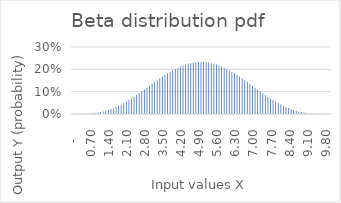
| Category | y-pdf |
|---|---|
| 0.0 | 0 |
| 0.1 | 0 |
| 0.2 | 0 |
| 0.30000000000000004 | 0 |
| 0.4 | 0 |
| 0.5 | 0.001 |
| 0.6 | 0.001 |
| 0.7 | 0.002 |
| 0.7999999999999999 | 0.003 |
| 0.8999999999999999 | 0.005 |
| 0.9999999999999999 | 0.007 |
| 1.0999999999999999 | 0.009 |
| 1.2 | 0.011 |
| 1.3 | 0.014 |
| 1.4000000000000001 | 0.018 |
| 1.5000000000000002 | 0.022 |
| 1.6000000000000003 | 0.027 |
| 1.7000000000000004 | 0.031 |
| 1.8000000000000005 | 0.037 |
| 1.9000000000000006 | 0.043 |
| 2.0000000000000004 | 0.049 |
| 2.1000000000000005 | 0.055 |
| 2.2000000000000006 | 0.062 |
| 2.3000000000000007 | 0.07 |
| 2.400000000000001 | 0.077 |
| 2.500000000000001 | 0.085 |
| 2.600000000000001 | 0.093 |
| 2.700000000000001 | 0.101 |
| 2.800000000000001 | 0.11 |
| 2.9000000000000012 | 0.118 |
| 3.0000000000000013 | 0.126 |
| 3.1000000000000014 | 0.135 |
| 3.2000000000000015 | 0.143 |
| 3.3000000000000016 | 0.151 |
| 3.4000000000000017 | 0.16 |
| 3.5000000000000018 | 0.167 |
| 3.600000000000002 | 0.175 |
| 3.700000000000002 | 0.182 |
| 3.800000000000002 | 0.189 |
| 3.900000000000002 | 0.196 |
| 4.000000000000002 | 0.202 |
| 4.100000000000001 | 0.207 |
| 4.200000000000001 | 0.213 |
| 4.300000000000001 | 0.217 |
| 4.4 | 0.221 |
| 4.5 | 0.225 |
| 4.6 | 0.228 |
| 4.699999999999999 | 0.23 |
| 4.799999999999999 | 0.232 |
| 4.899999999999999 | 0.232 |
| 4.999999999999998 | 0.233 |
| 5.099999999999998 | 0.232 |
| 5.1999999999999975 | 0.232 |
| 5.299999999999997 | 0.23 |
| 5.399999999999997 | 0.228 |
| 5.4999999999999964 | 0.225 |
| 5.599999999999996 | 0.221 |
| 5.699999999999996 | 0.217 |
| 5.799999999999995 | 0.213 |
| 5.899999999999995 | 0.207 |
| 5.999999999999995 | 0.202 |
| 6.099999999999994 | 0.196 |
| 6.199999999999994 | 0.189 |
| 6.299999999999994 | 0.182 |
| 6.399999999999993 | 0.175 |
| 6.499999999999993 | 0.167 |
| 6.5999999999999925 | 0.16 |
| 6.699999999999992 | 0.151 |
| 6.799999999999992 | 0.143 |
| 6.8999999999999915 | 0.135 |
| 6.999999999999991 | 0.126 |
| 7.099999999999991 | 0.118 |
| 7.19999999999999 | 0.11 |
| 7.29999999999999 | 0.101 |
| 7.39999999999999 | 0.093 |
| 7.499999999999989 | 0.085 |
| 7.599999999999989 | 0.077 |
| 7.699999999999989 | 0.07 |
| 7.799999999999988 | 0.062 |
| 7.899999999999988 | 0.055 |
| 7.999999999999988 | 0.049 |
| 8.099999999999987 | 0.043 |
| 8.199999999999987 | 0.037 |
| 8.299999999999986 | 0.031 |
| 8.399999999999986 | 0.027 |
| 8.499999999999986 | 0.022 |
| 8.599999999999985 | 0.018 |
| 8.699999999999985 | 0.014 |
| 8.799999999999985 | 0.011 |
| 8.899999999999984 | 0.009 |
| 8.999999999999984 | 0.007 |
| 9.099999999999984 | 0.005 |
| 9.199999999999983 | 0.003 |
| 9.299999999999983 | 0.002 |
| 9.399999999999983 | 0.001 |
| 9.499999999999982 | 0.001 |
| 9.599999999999982 | 0 |
| 9.699999999999982 | 0 |
| 9.799999999999981 | 0 |
| 9.89999999999998 | 0 |
| 9.99999999999998 | 0 |